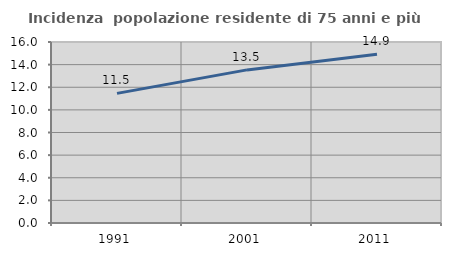
| Category | Incidenza  popolazione residente di 75 anni e più |
|---|---|
| 1991.0 | 11.457 |
| 2001.0 | 13.534 |
| 2011.0 | 14.921 |